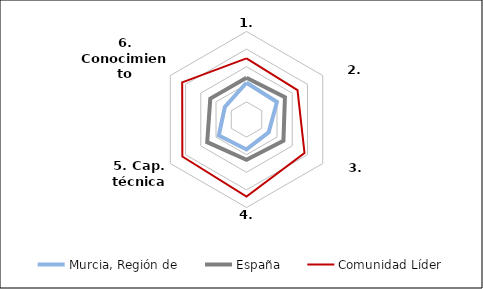
| Category | Murcia, Región de | España | Comunidad Líder |
|---|---|---|---|
| 1. Facilitar | 41.74 | 47.545 | 69.406 |
| 2. Atraer | 39.925 | 50.424 | 66.924 |
| 3. Crecer | 29.12 | 48.458 | 76.109 |
| 4. Retener | 34.001 | 45.853 | 87.606 |
| 5. Cap. técnicas | 36.332 | 51.565 | 84.188 |
| 6. Conocimiento | 28.411 | 47.508 | 84.398 |